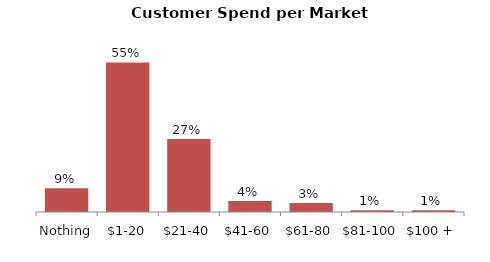
| Category | combined % |
|---|---|
| Nothing | 0.088 |
| $1-20 | 0.554 |
| $21-40 | 0.27 |
| $41-60 | 0.041 |
| $61-80 | 0.034 |
| $81-100 | 0.007 |
| $100 + | 0.007 |